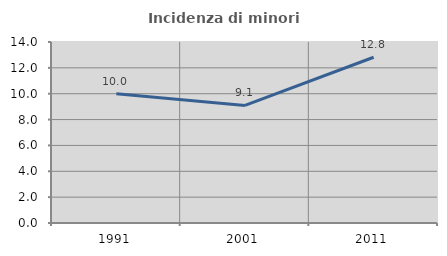
| Category | Incidenza di minori stranieri |
|---|---|
| 1991.0 | 10 |
| 2001.0 | 9.091 |
| 2011.0 | 12.821 |